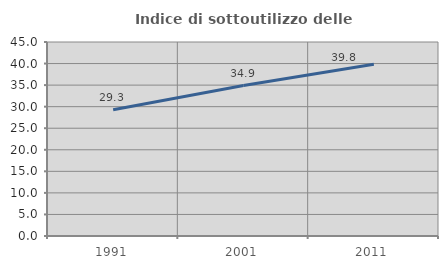
| Category | Indice di sottoutilizzo delle abitazioni  |
|---|---|
| 1991.0 | 29.262 |
| 2001.0 | 34.899 |
| 2011.0 | 39.821 |